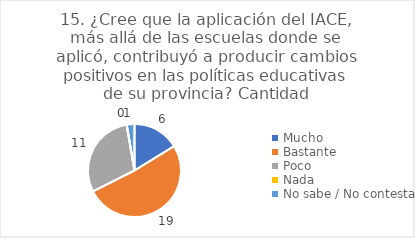
| Category | 15. ¿Cree que la aplicación del IACE, más allá de las escuelas donde se aplicó, contribuyó a producir cambios positivos en las políticas educativas de su provincia? |
|---|---|
| Mucho  | 0.162 |
| Bastante  | 0.514 |
| Poco  | 0.297 |
| Nada  | 0 |
| No sabe / No contesta | 0.027 |